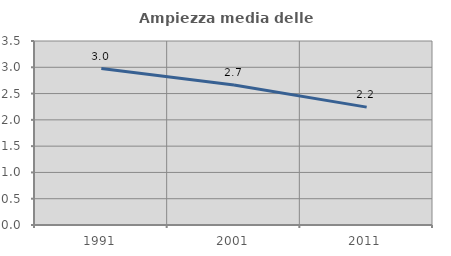
| Category | Ampiezza media delle famiglie |
|---|---|
| 1991.0 | 2.976 |
| 2001.0 | 2.661 |
| 2011.0 | 2.242 |